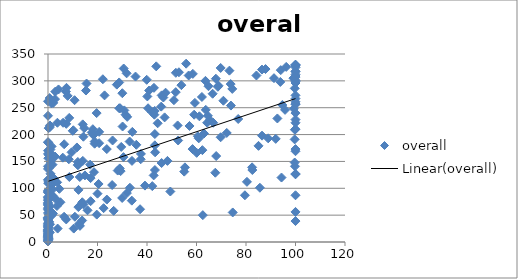
| Category | overall |
|---|---|
| 0.7637944637491397 | 214 |
| 100.0 | 296 |
| 43.28577315339446 | 167 |
| 7.236529135692021 | 280 |
| 1.445707354328586 | 163 |
| 42.69792205006192 | 124 |
| 58.40831869836269 | 173 |
| 94.68050716569088 | 255 |
| 0.0 | 1 |
| 0.117484187263444 | 156 |
| 19.998074286683693 | 90 |
| 20.438616009345274 | 108 |
| 1.4616813860334925 | 178 |
| 28.16789689667379 | 133 |
| 63.75061583795792 | 246 |
| 45.89784564393939 | 147 |
| 30.489223030532493 | 158 |
| 0.0544786983711327 | 68 |
| 0.034071236509632036 | 8 |
| 20.665035808768998 | 205 |
| 5.026916921286192 | 74 |
| 0.0 | 170 |
| 47.12103898999471 | 232 |
| 3.6972350212764327 | 111 |
| 37.200230108222776 | 61 |
| 0.14073217443447084 | 109 |
| 6.507528996194534 | 47 |
| 12.62384818512923 | 34 |
| 67.95545441486668 | 160 |
| 100.0 | 169 |
| 0.0 | 35 |
| 30.031276490017834 | 277 |
| 1.207139483150513 | 89 |
| 0.0 | 83 |
| 48.25793075548663 | 151 |
| 1.0562570202860893 | 149 |
| 30.59092615983341 | 323 |
| 2.020527084027722 | 53 |
| 2.9607863193818056 | 280 |
| 6.0886474887681885 | 222 |
| 2.8663936240867836 | 159 |
| 29.59008926944799 | 177 |
| 0.0 | 28 |
| 0.0 | 17 |
| 33.929886900377 | 151 |
| 18.569516442722236 | 130 |
| 28.76568102583458 | 297 |
| 0.6693054225278974 | 268 |
| 53.888083105503426 | 292 |
| 25.9205375782881 | 106 |
| 23.760054046474867 | 173 |
| 0.0 | 96 |
| 43.11820688293243 | 244 |
| 50.87952273166737 | 264 |
| 40.42715602707038 | 249 |
| 1.855845457582845 | 98 |
| 100.0 | 312 |
| 46.59888701026772 | 269 |
| 39.89136934422962 | 302 |
| 1.3971654949224417 | 258 |
| 0.0 | 186 |
| 33.09534052020264 | 101 |
| 100.0 | 87 |
| 7.370596524189761 | 42 |
| 92.01860636485056 | 192 |
| 100.0 | 328 |
| 0.746883281637099 | 18 |
| 86.46459367650901 | 321 |
| 0.0 | 62 |
| 0.0 | 72 |
| 35.67288416281705 | 181 |
| 12.071188799738005 | 143 |
| 12.322655794991263 | 97 |
| 94.34807406067857 | 120 |
| 0.1681270734169912 | 5 |
| 100.0 | 318 |
| 17.02594998274185 | 144 |
| 62.5593415007657 | 50 |
| 0.0 | 77 |
| 74.63444292445661 | 55 |
| 0.0 | 32 |
| 100.0 | 127 |
| 73.80669352586861 | 294 |
| 73.29371532427778 | 319 |
| 67.82373688791169 | 304 |
| 31.992104935969166 | 233 |
| 100.0 | 126 |
| 60.072694942733115 | 166 |
| 70.86727207331086 | 263 |
| 37.457425971845666 | 154 |
| 0.0 | 164 |
| 31.867045913500785 | 91 |
| 100.0 | 329 |
| 15.57400562244388 | 295 |
| 0.12833309567945245 | 64 |
| 35.37158750393192 | 308 |
| 3.8021058275127704 | 222 |
| 10.000454153231301 | 207 |
| 3.8996361540401314 | 25 |
| 1.6071758831144811 | 107 |
| 85.05961340883569 | 179 |
| 100.0 | 240 |
| 95.78769903215735 | 246 |
| 41.93909752865476 | 242 |
| 10.233538760947129 | 208 |
| 18.348960712142787 | 199 |
| 0.2691300552807681 | 27 |
| 0.0 | 46 |
| 19.701186465504612 | 51 |
| 26.530140634284834 | 58 |
| 0.0 | 16 |
| 29.146506826096335 | 249 |
| 0.0 | 11 |
| 3.618902568007784 | 67 |
| 100.0 | 261 |
| 0.0 | 22 |
| 93.86896046852124 | 298 |
| 0.0 | 92 |
| 0.0 | 84 |
| 43.735383883625985 | 327 |
| 0.08556718474293587 | 185 |
| 30.841110327768952 | 245 |
| 2.8453450065436163 | 266 |
| 0.0 | 116 |
| 22.462731935370623 | 63 |
| 0.7767569396221712 | 217 |
| 66.52737365018207 | 276 |
| 40.86087592323751 | 282 |
| 66.76490946033448 | 222 |
| 2.9496008539294354 | 81 |
| 28.993841063562613 | 137 |
| 60.55036115405695 | 197 |
| 0.0 | 45 |
| 99.79281283667915 | 141 |
| 10.734324546648823 | 264 |
| 0.10506265321636928 | 93 |
| 85.60923658204315 | 101 |
| 100.0 | 56 |
| 0.0 | 14 |
| 0.0 | 94 |
| 29.35066839365576 | 132 |
| 69.75733108557739 | 195 |
| 0.0 | 23 |
| 0.2576215885531727 | 212 |
| 12.830539127034557 | 121 |
| 1.427262100844801 | 49 |
| 0.0 | 13 |
| 28.767941244523392 | 249 |
| 12.265823598996596 | 65 |
| 0.21238394734305896 | 7 |
| 64.59139749970183 | 235 |
| 0.0 | 24 |
| 59.343572570864325 | 259 |
| 0.0 | 31 |
| 0.0 | 60 |
| 0.0 | 6 |
| 32.98007813343118 | 187 |
| 100.0 | 173 |
| 52.90693645624004 | 316 |
| 0.024936704029313347 | 3 |
| 14.643333435136263 | 212 |
| 10.405720079997756 | 25 |
| 100.0 | 228 |
| 100.0 | 267 |
| 0.0 | 73 |
| 100.0 | 307 |
| 99.67275984016901 | 148 |
| 100.0 | 222 |
| 0.3082920177564345 | 162 |
| 10.865057923455012 | 47 |
| 47.506692398680194 | 278 |
| 45.91678049184302 | 273 |
| 63.6118801438876 | 300 |
| 1.828697010005205 | 144 |
| 19.65760882914009 | 240 |
| 0.0 | 2 |
| 64.84256243213899 | 290 |
| 100.0 | 309 |
| 73.91385168279409 | 254 |
| 12.131049831654101 | 144 |
| 31.32056106739651 | 237 |
| 80.37682114279035 | 112 |
| 52.383851078034795 | 217 |
| 100.0 | 256 |
| 55.04359184020219 | 131 |
| 8.625588951222825 | 121 |
| 76.85391085758484 | 229 |
| 57.179339995079836 | 216 |
| 0.8091830956915633 | 33 |
| 79.55839991658085 | 87 |
| 0.2318945455442532 | 110 |
| 0.0 | 43 |
| 2.013574850450118 | 160 |
| 0.0 | 141 |
| 8.409823180905192 | 154 |
| 0.9414389291689905 | 100 |
| 14.298841300791143 | 196 |
| 12.903081016960021 | 30 |
| 0.0 | 21 |
| 4.59032791162912 | 99 |
| 0.0 | 4 |
| 6.534722222222222 | 182 |
| 84.22157987444108 | 310 |
| 0.3395301070986943 | 51 |
| 0.0 | 54 |
| 44.315201850747556 | 221 |
| 2.4613979217681465 | 118 |
| 4.259108928838833 | 284 |
| 92.6770953034066 | 230 |
| 0.0 | 262 |
| 100.0 | 317 |
| 1.599050685237961 | 117 |
| 22.858379369160666 | 273 |
| 15.33829098042794 | 282 |
| 51.65038319780027 | 315 |
| 12.059102179040092 | 149 |
| 26.09302112869295 | 189 |
| 7.373336745138179 | 220 |
| 56.837898246012806 | 310 |
| 0.0 | 20 |
| 100.0 | 299 |
| 100.0 | 325 |
| 0.45647091502511516 | 138 |
| 0.0 | 28 |
| 45.74674164488161 | 252 |
| 65.44043358795925 | 227 |
| 11.682421532278607 | 176 |
| 100.0 | 210 |
| 69.76480485752954 | 324 |
| 1.8371987444152391 | 86 |
| 37.542201215395 | 164 |
| 74.4524388393503 | 285 |
| 0.259039124129201 | 15 |
| 9.517627184913756 | 167 |
| 58.52766272904546 | 313 |
| 82.5569939811893 | 134 |
| 43.20443612059785 | 134 |
| 18.860218819093532 | 187 |
| 96.243896484375 | 326 |
| 100.0 | 39 |
| 67.5933496865631 | 129 |
| 100.0 | 330 |
| 88.96346751463467 | 193 |
| 99.6648666422167 | 191 |
| 99.12840782405999 | 305 |
| 7.943114810960806 | 272 |
| 72.21828443484655 | 203 |
| 40.13803637597941 | 271 |
| 0.19047245022189058 | 115 |
| 0.0 | 9 |
| 0.0 | 80 |
| 0.0 | 10 |
| 0.9650608143253981 | 172 |
| 31.77206759289376 | 314 |
| 62.37950640934194 | 171 |
| 23.77052427821894 | 79 |
| 43.168981961434795 | 201 |
| 64.31785533209397 | 222 |
| 0.4167503514762001 | 38 |
| 8.575526215885604 | 231 |
| 14.076459879568686 | 151 |
| 0.39193845360953283 | 37 |
| 99.69889505237971 | 286 |
| 51.61945572931159 | 279 |
| 82.45973518558715 | 139 |
| 0.5979105200895084 | 66 |
| 22.168040607111234 | 303 |
| 0.2494763219744745 | 113 |
| 49.42907208932719 | 94 |
| 13.800819553798489 | 40 |
| 1.0957424324260854 | 57 |
| 0.13304305757135945 | 35 |
| 55.80836364093981 | 332 |
| 43.175152510558426 | 180 |
| 91.30743919175886 | 305 |
| 15.980182753434526 | 59 |
| 60.91115680121199 | 193 |
| 52.58206565252201 | 189 |
| 55.32204098703472 | 139 |
| 5.968688845401174 | 157 |
| 7.4744694720069536 | 287 |
| 13.85046977424252 | 74 |
| 63.03960009663092 | 202 |
| 14.928187681839871 | 124 |
| 100.0 | 301 |
| 0.0 | 12 |
| 0.363430248066151 | 114 |
| 42.14543916320566 | 104 |
| 100.0 | 257 |
| 61.17090827221323 | 234 |
| 29.964402875689256 | 82 |
| 1.0231441444643203 | 127 |
| 0.0 | 43 |
| 0.0 | 19 |
| 17.211780530825234 | 119 |
| 30.135321865916996 | 215 |
| 0.0 | 235 |
| 39.177862799181426 | 105 |
| 68.89536896026581 | 291 |
| 87.8876017465751 | 322 |
| 33.86003272962306 | 77 |
| 14.038794916245243 | 219 |
| 42.79997788436286 | 287 |
| 100.0 | 330 |
| 94.04959394550521 | 320 |
| 62.195301840174054 | 270 |
| 99.76851560632556 | 209 |
| 86.48319966451749 | 198 |
| 100.0 | 273 |
| 0.0 | 41 |
| 20.65757213805243 | 184 |
| 14.342671770411108 | 70 |
| 68.61832050494743 | 289 |
| 59.052753320399944 | 237 |
| 18.11976558816265 | 210 |
| 18.83923824409242 | 183 |
| 2.134727501755716 | 259 |
| 17.670824403296017 | 204 |
| 0.0 | 70 |
| 0.13719185423365488 | 69 |
| 0.0 | 136 |
| 99.33074246863963 | 248 |
| 34.08380160497406 | 205 |
| 27.807831136964367 | 293 |
| 42.98233884323023 | 237 |
| 17.22379228119756 | 76 |